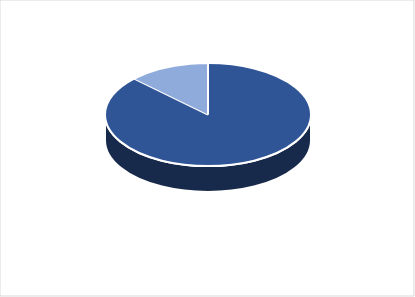
| Category | Series 1 | Series 0 |
|---|---|---|
| PRESUPUESTO VIGENTE PARA 2023 | 25000000 | 25000000 |
| PRESUPUESTO EJECUTADO  | 3644574.37 | 3644574.37 |
| PORCENTAJE DE EJECUCIÓN  | 0.146 | 0.146 |